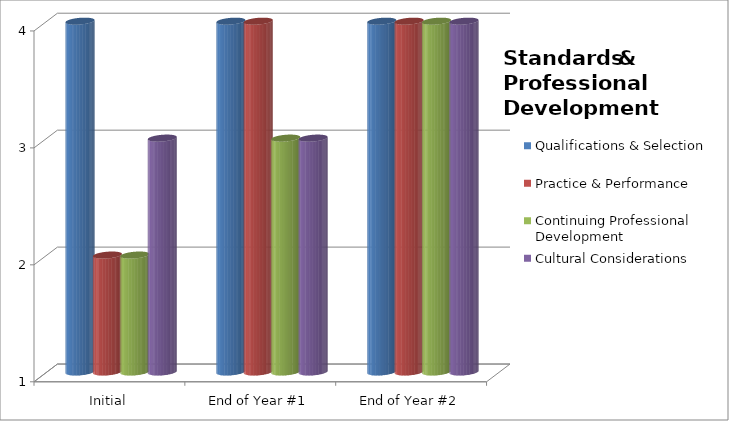
| Category | Qualifications & Selection  | Practice & Performance  | Continuing Professional Development  | Cultural Considerations  |
|---|---|---|---|---|
| Initial | 4 | 2 | 2 | 3 |
| End of Year #1 | 4 | 4 | 3 | 3 |
| End of Year #2 | 4 | 4 | 4 | 4 |